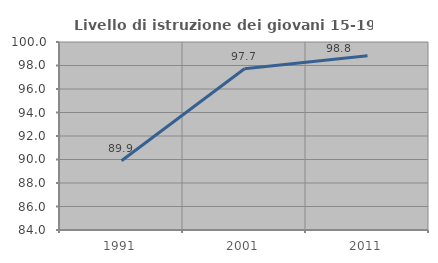
| Category | Livello di istruzione dei giovani 15-19 anni |
|---|---|
| 1991.0 | 89.888 |
| 2001.0 | 97.727 |
| 2011.0 | 98.824 |